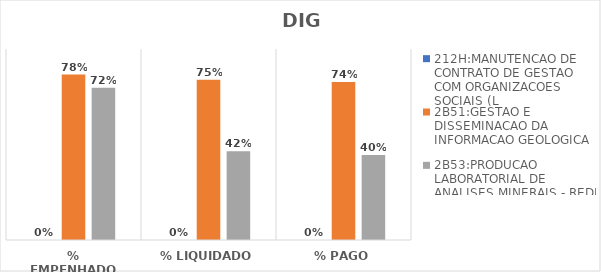
| Category | 212H:MANUTENCAO DE CONTRATO DE GESTAO COM ORGANIZACOES SOCIAIS (L | 2B51:GESTAO E DISSEMINACAO DA INFORMACAO GEOLOGICA | 2B53:PRODUCAO LABORATORIAL DE ANALISES MINERAIS - REDE LAMIN |
|---|---|---|---|
| % EMPENHADO | 0 | 0.779 | 0.718 |
| % LIQUIDADO | 0 | 0.755 | 0.418 |
| % PAGO | 0 | 0.744 | 0.4 |